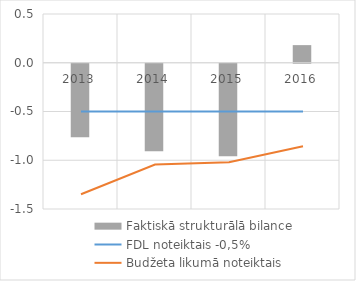
| Category | Faktiskā strukturālā bilance |
|---|---|
| 2013.0 | -0.754 |
| 2014.0 | -0.897 |
| 2015.0 | -0.949 |
| 2016.0 | 0.181 |